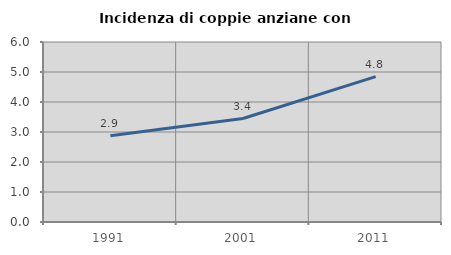
| Category | Incidenza di coppie anziane con figli |
|---|---|
| 1991.0 | 2.878 |
| 2001.0 | 3.448 |
| 2011.0 | 4.847 |